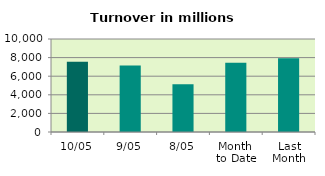
| Category | Series 0 |
|---|---|
| 10/05 | 7541.302 |
| 9/05 | 7156.422 |
| 8/05 | 5143.543 |
| Month 
to Date | 7433.419 |
| Last
Month | 7939.051 |